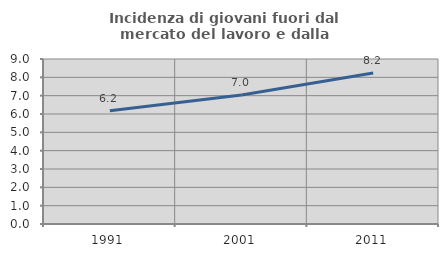
| Category | Incidenza di giovani fuori dal mercato del lavoro e dalla formazione  |
|---|---|
| 1991.0 | 6.176 |
| 2001.0 | 7.036 |
| 2011.0 | 8.238 |